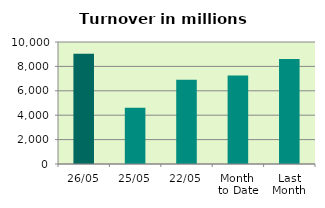
| Category | Series 0 |
|---|---|
| 26/05 | 9032.886 |
| 25/05 | 4613.712 |
| 22/05 | 6905.9 |
| Month 
to Date | 7248.149 |
| Last
Month | 8604.869 |